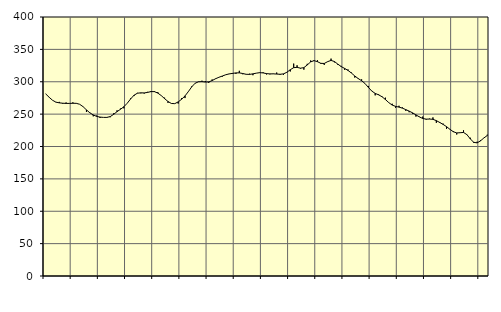
| Category | Piggar | Series 1 |
|---|---|---|
| nan | 281 | 281.24 |
| 87.0 | 276.2 | 276.09 |
| 87.0 | 271.5 | 271.44 |
| 87.0 | 268.3 | 268.53 |
| nan | 268.9 | 267.4 |
| 88.0 | 266.1 | 266.85 |
| 88.0 | 268 | 266.55 |
| 88.0 | 266.9 | 266.56 |
| nan | 268.2 | 266.75 |
| 89.0 | 267 | 266.68 |
| 89.0 | 265.2 | 265.19 |
| 89.0 | 261.7 | 261.53 |
| nan | 253.4 | 256.52 |
| 90.0 | 252.4 | 252.01 |
| 90.0 | 246.6 | 248.76 |
| 90.0 | 247.8 | 246.52 |
| nan | 244 | 245.4 |
| 91.0 | 245 | 244.96 |
| 91.0 | 245.4 | 244.95 |
| 91.0 | 245.2 | 246.22 |
| nan | 251.3 | 249.6 |
| 92.0 | 255.8 | 253.83 |
| 92.0 | 258.6 | 257.41 |
| 92.0 | 259 | 261.33 |
| nan | 266.8 | 266.8 |
| 93.0 | 274.4 | 273.44 |
| 93.0 | 277.9 | 279.18 |
| 93.0 | 282.8 | 282.31 |
| nan | 282.2 | 282.87 |
| 94.0 | 281.8 | 282.74 |
| 94.0 | 284.4 | 283.55 |
| 94.0 | 285.7 | 284.8 |
| nan | 285.6 | 284.74 |
| 95.0 | 284 | 282.5 |
| 95.0 | 278.6 | 278.71 |
| 95.0 | 275.4 | 273.93 |
| nan | 267.4 | 269.5 |
| 96.0 | 266.2 | 266.45 |
| 96.0 | 266.1 | 266.17 |
| 96.0 | 266.3 | 268.9 |
| nan | 274.6 | 272.88 |
| 97.0 | 274.8 | 278.07 |
| 97.0 | 285.1 | 284.81 |
| 97.0 | 293.1 | 292.22 |
| nan | 298.1 | 297.74 |
| 98.0 | 299.6 | 299.95 |
| 98.0 | 301.6 | 300.14 |
| 98.0 | 301.1 | 299.56 |
| nan | 298.2 | 299.75 |
| 99.0 | 303.5 | 301.79 |
| 99.0 | 305 | 304.64 |
| 99.0 | 306.9 | 306.92 |
| nan | 307.9 | 308.84 |
| 0.0 | 310.9 | 310.81 |
| 0.0 | 311.9 | 312.1 |
| 0.0 | 312.2 | 312.91 |
| nan | 312.2 | 313.65 |
| 1.0 | 316.9 | 313.73 |
| 1.0 | 311.6 | 312.74 |
| 1.0 | 311.3 | 311.52 |
| nan | 312.4 | 311.38 |
| 2.0 | 310.1 | 312.19 |
| 2.0 | 313.2 | 313.27 |
| 2.0 | 313.7 | 314.04 |
| nan | 314.6 | 313.65 |
| 3.0 | 311.3 | 312.55 |
| 3.0 | 311.5 | 312.12 |
| 3.0 | 312.5 | 312.21 |
| nan | 314.2 | 311.89 |
| 4.0 | 310.8 | 311.54 |
| 4.0 | 310.7 | 312.17 |
| 4.0 | 315.1 | 314.67 |
| nan | 315.9 | 318.57 |
| 5.0 | 328 | 321.79 |
| 5.0 | 325.4 | 322.26 |
| 5.0 | 320.3 | 320.95 |
| nan | 318.7 | 321.81 |
| 6.0 | 327.7 | 325.91 |
| 6.0 | 332.8 | 330.68 |
| 6.0 | 333.5 | 332.58 |
| nan | 333.2 | 331.03 |
| 7.0 | 327.6 | 328.45 |
| 7.0 | 326 | 328.25 |
| 7.0 | 330.8 | 331.04 |
| nan | 335.7 | 332.96 |
| 8.0 | 329.9 | 331.24 |
| 8.0 | 326.1 | 327.22 |
| 8.0 | 324.5 | 323.4 |
| nan | 318.5 | 320.57 |
| 9.0 | 318.9 | 317.49 |
| 9.0 | 314.2 | 313.43 |
| 9.0 | 306.4 | 308.9 |
| nan | 304.3 | 304.91 |
| 10.0 | 303.7 | 301.57 |
| 10.0 | 297.1 | 297.27 |
| 10.0 | 293.5 | 291.22 |
| nan | 285.9 | 285.56 |
| 11.0 | 279 | 282 |
| 11.0 | 280.6 | 279.8 |
| 11.0 | 277.5 | 276.9 |
| nan | 275.4 | 272.55 |
| 12.0 | 267.6 | 267.76 |
| 12.0 | 266 | 263.97 |
| 12.0 | 259.8 | 261.96 |
| nan | 262.9 | 260.85 |
| 13.0 | 260.4 | 259.22 |
| 13.0 | 255.1 | 256.99 |
| 13.0 | 252.9 | 254.64 |
| nan | 250.5 | 251.96 |
| 14.0 | 246.2 | 248.82 |
| 14.0 | 246.1 | 245.72 |
| 14.0 | 246.2 | 243.25 |
| nan | 241.5 | 242.26 |
| 15.0 | 243 | 242.38 |
| 15.0 | 244.9 | 241.95 |
| 15.0 | 236.6 | 239.95 |
| nan | 236.4 | 237.1 |
| 16.0 | 235.3 | 234.09 |
| 16.0 | 227.3 | 230.66 |
| 16.0 | 226.3 | 226.57 |
| nan | 223.9 | 222.79 |
| 17.0 | 218.5 | 220.99 |
| 17.0 | 221.5 | 221.3 |
| 17.0 | 225 | 221.71 |
| nan | 217.9 | 218.3 |
| 18.0 | 213.5 | 211.74 |
| 18.0 | 205.4 | 206.49 |
| 18.0 | 207.4 | 205.59 |
| nan | 209.8 | 208.72 |
| 19.0 | 213.3 | 213.22 |
| 19.0 | 218.2 | 217 |